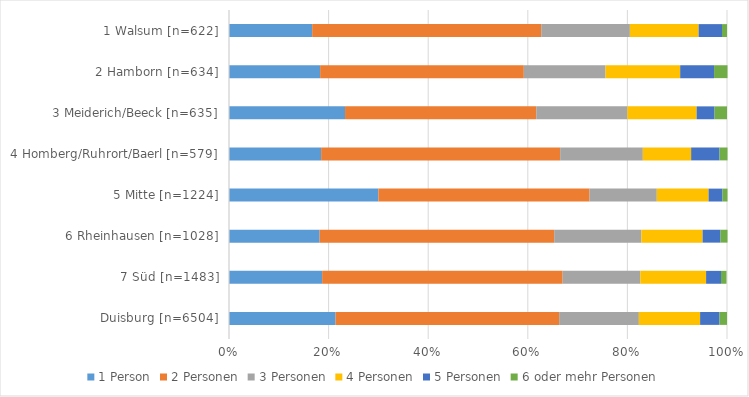
| Category | 1 Person | 2 Personen | 3 Personen | 4 Personen | 5 Personen | 6 oder mehr Personen |
|---|---|---|---|---|---|---|
| Duisburg [n=6504] | 0.214 | 0.449 | 0.16 | 0.123 | 0.039 | 0.015 |
| 7 Süd [n=1483] | 0.187 | 0.483 | 0.156 | 0.132 | 0.03 | 0.011 |
| 6 Rheinhausen [n=1028] | 0.182 | 0.471 | 0.175 | 0.123 | 0.036 | 0.014 |
| 5 Mitte [n=1224] | 0.3 | 0.424 | 0.135 | 0.104 | 0.028 | 0.01 |
| 4 Homberg/Ruhrort/Baerl [n=579] | 0.185 | 0.48 | 0.166 | 0.097 | 0.057 | 0.016 |
| 3 Meiderich/Beeck [n=635] | 0.233 | 0.384 | 0.183 | 0.139 | 0.036 | 0.025 |
| 2 Hamborn [n=634] | 0.183 | 0.409 | 0.164 | 0.15 | 0.068 | 0.027 |
| 1 Walsum [n=622] | 0.167 | 0.46 | 0.178 | 0.138 | 0.047 | 0.01 |